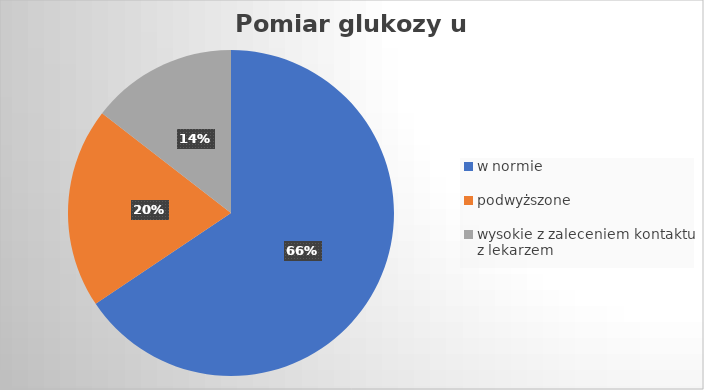
| Category | Series 0 |
|---|---|
| w normie | 65.591 |
| podwyższone | 19.892 |
| wysokie z zaleceniem kontaktu z lekarzem | 14.516 |